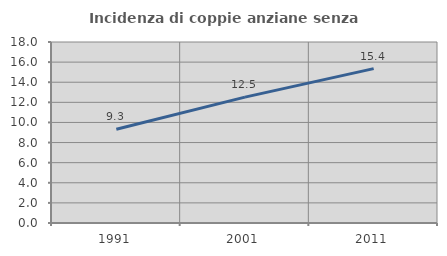
| Category | Incidenza di coppie anziane senza figli  |
|---|---|
| 1991.0 | 9.324 |
| 2001.0 | 12.516 |
| 2011.0 | 15.35 |